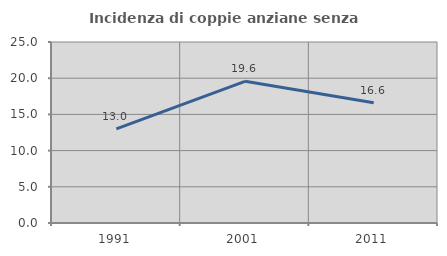
| Category | Incidenza di coppie anziane senza figli  |
|---|---|
| 1991.0 | 13.004 |
| 2001.0 | 19.569 |
| 2011.0 | 16.608 |